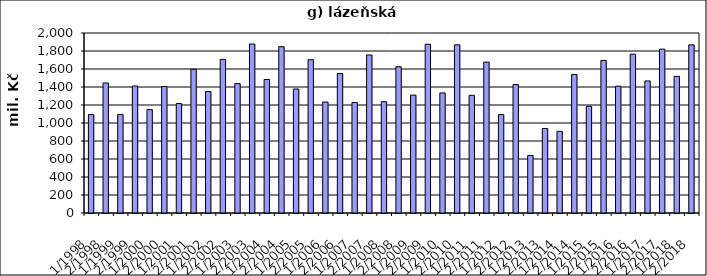
| Category | Series 0 |
|---|---|
| 1/1998 | 1093697.223 |
| 2/1998 | 1445121.777 |
| 1/1999 | 1095017.008 |
| 2/1999 | 1410531.992 |
| 1/2000 | 1148664.966 |
| 2/2000 | 1406075.114 |
| 1/2001 | 1216051.406 |
| 2/2001 | 1597020.846 |
| 1/2002 | 1349965 |
| 2/2002 | 1707345 |
| 1/2003 | 1437554 |
| 2/2003 | 1877755.844 |
| 1/2004 | 1483496.35 |
| 2/2004 | 1847622.219 |
| 1/2005 | 1377774 |
| 2/2005 | 1703037.967 |
| 1/2006 | 1233063 |
| 2/2006 | 1549740 |
| 1/2007 | 1227630 |
| 2/2007 | 1755982 |
| 1/2008 | 1236587.585 |
| 2/2008 | 1625065.415 |
| 1/2009 | 1309796.173 |
| 2/2009 | 1875476 |
| 1/2010 | 1334023 |
| 2/2010 | 1868560 |
| 1/2011 | 1308077 |
| 2/2011 | 1676678 |
| 1/2012 | 1093500 |
| 2/2012 | 1427027 |
| 1/2013 | 639451 |
| 2/2013 | 939404 |
| 1/2014 | 907680 |
| 2/2014 | 1538084 |
| 1/2015 | 1185565 |
| 2/2015 | 1695227 |
| 1/2016 | 1409299 |
| 2/2016 | 1764915 |
| 1/2017 | 1467248 |
| 2/2017 | 1820357 |
| 1/2018 | 1518470.317 |
| 2/2018 | 1868176.197 |